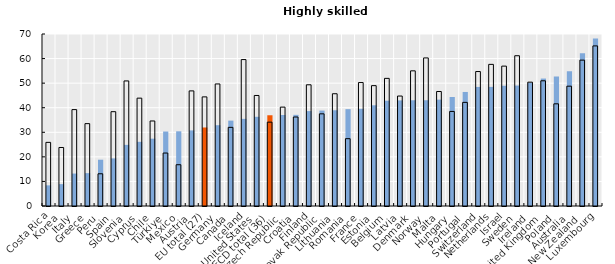
| Category | Foreign-born | Native-born |
|---|---|---|
| Costa Rica | 8.4 | 25.9 |
| Korea | 8.899 | 23.81 |
| Italy | 13.201 | 39.232 |
| Greece | 13.37 | 33.522 |
| Peru | 18.838 | 13.115 |
| Spain | 19.367 | 38.388 |
| Slovenia | 24.881 | 50.899 |
| Cyprus | 26.124 | 43.892 |
| Chile | 27.4 | 34.6 |
| Türkiye | 30.312 | 21.551 |
| Mexico | 30.4 | 16.8 |
| Austria | 30.761 | 46.844 |
| EU total (27) | 31.954 | 44.408 |
| Germany | 32.878 | 49.674 |
| Canada | 34.749 | 32.01 |
| Iceland | 35.46 | 59.596 |
| United States | 36.306 | 44.982 |
| OECD total (36) | 36.929 | 34.127 |
| Czech Republic | 37.041 | 40.243 |
| Croatia | 37.096 | 36.218 |
| Finland | 38.629 | 49.331 |
| Slovak Republic | 38.838 | 37.508 |
| Lithuania | 38.959 | 45.688 |
| Romania | 39.415 | 27.397 |
| France | 39.553 | 50.238 |
| Estonia | 40.989 | 48.981 |
| Belgium | 42.859 | 51.945 |
| Latvia | 42.979 | 44.752 |
| Denmark | 43.033 | 55.012 |
| Norway | 43.039 | 60.262 |
| Malta | 43.292 | 46.604 |
| Hungary | 44.361 | 38.489 |
| Portugal | 46.41 | 42.175 |
| Switzerland | 48.461 | 54.723 |
| Netherlands | 48.476 | 57.639 |
| Israel | 48.932 | 56.93 |
| Sweden | 49.019 | 61.16 |
| Ireland | 50.148 | 50.401 |
| United Kingdom | 51.873 | 50.955 |
| Poland | 52.657 | 41.584 |
| Australia | 54.814 | 48.766 |
| New Zealand | 62.128 | 59.368 |
| Luxembourg | 68.12 | 65.158 |